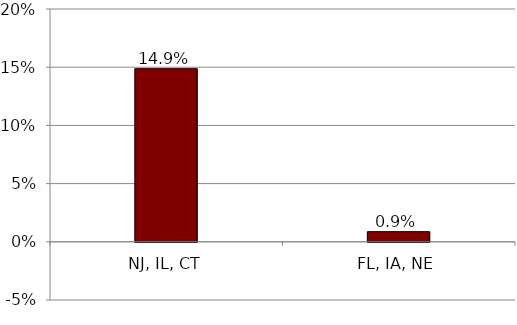
| Category | Series 1 |
|---|---|
| NJ, IL, CT | 0.149 |
| FL, IA, NE | 0.009 |